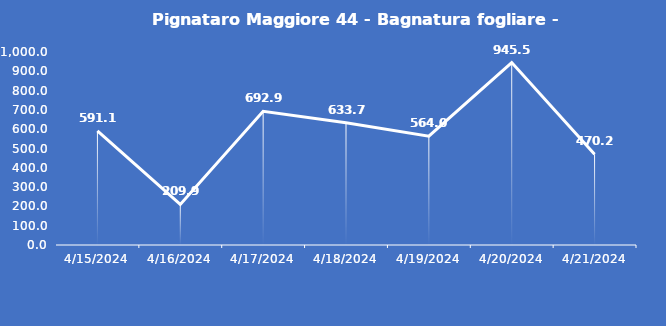
| Category | Pignataro Maggiore 44 - Bagnatura fogliare - Grezzo (min) |
|---|---|
| 4/15/24 | 591.1 |
| 4/16/24 | 209.9 |
| 4/17/24 | 692.9 |
| 4/18/24 | 633.7 |
| 4/19/24 | 564 |
| 4/20/24 | 945.5 |
| 4/21/24 | 470.2 |